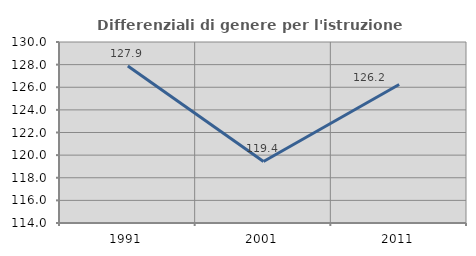
| Category | Differenziali di genere per l'istruzione superiore |
|---|---|
| 1991.0 | 127.871 |
| 2001.0 | 119.437 |
| 2011.0 | 126.242 |